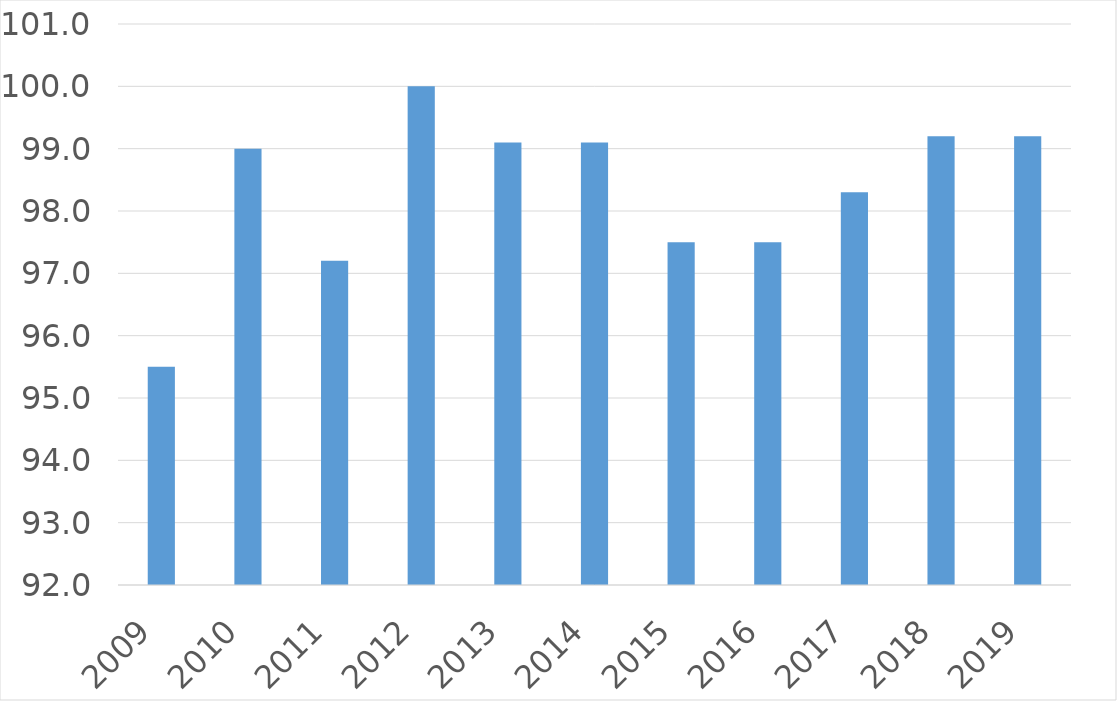
| Category | Series 0 |
|---|---|
| 2009 | 95.5 |
| 2010 | 99 |
| 2011 | 97.2 |
| 2012 | 100 |
| 2013 | 99.1 |
| 2014 | 99.1 |
| 2015 | 97.5 |
| 2016 | 97.5 |
| 2017 | 98.3 |
| 2018 | 99.2 |
| 2019 | 99.2 |